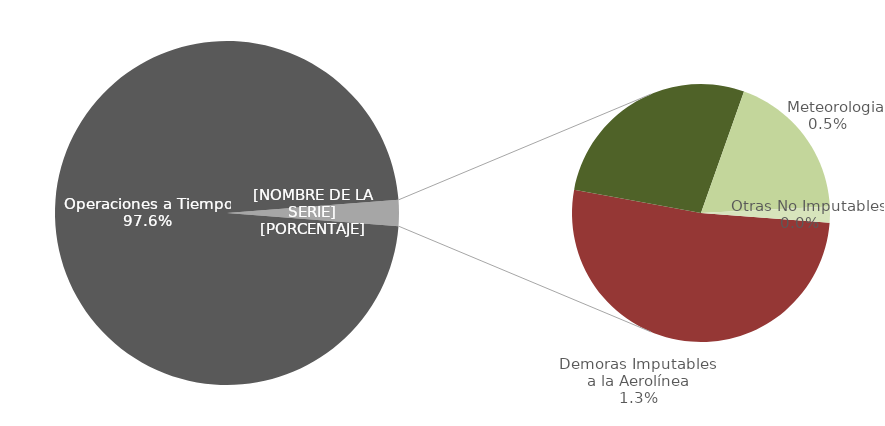
| Category | Demoras |
|---|---|
| Operaciones a Tiempo | 5974 |
| Demoras Imputables 
a la Aerolínea | 77 |
|    Aplicación de Control 
de Flujo | 41 |
|    Repercusiones por un 
Tercero | 0 |
|    Meteorologia | 28 |
|    Otras No Imputables | 3 |